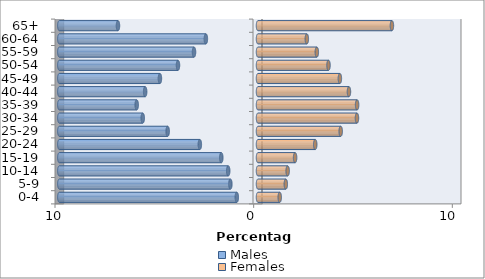
| Category | Males | Females |
|---|---|---|
| 0-4 | -1.067 | 1.093 |
| 5-9 | -1.391 | 1.4 |
| 10-14 | -1.499 | 1.493 |
| 15-19 | -1.848 | 1.868 |
| 20-24 | -2.928 | 2.881 |
| 25-29 | -4.547 | 4.163 |
| 30-34 | -5.802 | 4.982 |
| 35-39 | -6.106 | 4.988 |
| 40-44 | -5.68 | 4.578 |
| 45-49 | -4.937 | 4.121 |
| 50-54 | -4.028 | 3.549 |
| 55-59 | -3.221 | 2.961 |
| 60-64 | -2.624 | 2.458 |
| 65+ | -7.049 | 6.74 |